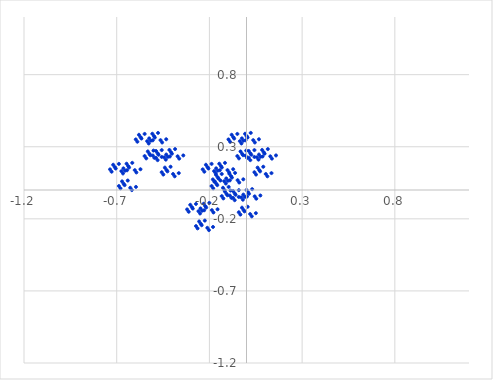
| Category | Series 0 |
|---|---|
| 0.0 | 0 |
| 0.00855245310052131 | -0.016 |
| 0.030649540012601 | 0.006 |
| -0.0171049062010425 | -0.032 |
| -0.00855245310052136 | -0.048 |
| 0.0135446338115583 | -0.026 |
| 0.0441941738241594 | -0.044 |
| 0.0527466269246802 | -0.06 |
| 0.0748437138367601 | -0.038 |
| -0.0722217192976518 | -0.007 |
| -0.0636692661971308 | -0.023 |
| -0.0415721792850513 | -0.001 |
| -0.0893266254986948 | -0.039 |
| -0.0807741723981737 | -0.055 |
| -0.0586770854860936 | -0.033 |
| -0.028027545473493 | -0.051 |
| -0.0194750923729719 | -0.067 |
| 0.0026219945391079 | -0.045 |
| -0.0243862902520157 | -0.123 |
| -0.0158338371514948 | -0.139 |
| 0.00626324976058479 | -0.117 |
| -0.0414911964530583 | -0.155 |
| -0.0329387433525374 | -0.171 |
| -0.0108416564404578 | -0.149 |
| 0.019807883572143 | -0.167 |
| 0.028360336672664 | -0.183 |
| 0.0504574235847445 | -0.161 |
| -0.0920773248729208 | 0.112 |
| -0.0835248717723997 | 0.096 |
| -0.0614277848603201 | 0.118 |
| -0.109182231073963 | 0.08 |
| -0.100629777973442 | 0.064 |
| -0.0785326910613623 | 0.086 |
| -0.0478831510487616 | 0.068 |
| -0.0393306979482406 | 0.052 |
| -0.0172336110361608 | 0.074 |
| -0.164299044170573 | 0.105 |
| -0.155746591070052 | 0.089 |
| -0.133649504157973 | 0.111 |
| -0.181403950371616 | 0.073 |
| -0.172851497271095 | 0.057 |
| -0.150754410359015 | 0.079 |
| -0.120104870346413 | 0.061 |
| -0.111552417245893 | 0.045 |
| -0.089455330333813 | 0.067 |
| -0.116463615124937 | -0.01 |
| -0.107911162024416 | -0.026 |
| -0.0858140751123364 | -0.004 |
| -0.13356852132598 | -0.042 |
| -0.125016068225458 | -0.058 |
| -0.102918981313379 | -0.036 |
| -0.0722694413007778 | -0.055 |
| -0.0637169882002568 | -0.071 |
| -0.0416199012881766 | -0.048 |
| -0.230969883127822 | -0.096 |
| -0.2224174300273 | -0.112 |
| -0.20032034311522 | -0.09 |
| -0.248074789328864 | -0.128 |
| -0.239522336228342 | -0.144 |
| -0.217425249316263 | -0.122 |
| -0.186775709303662 | -0.14 |
| -0.178223256203141 | -0.156 |
| -0.156126169291061 | -0.134 |
| -0.303191602425473 | -0.103 |
| -0.294639149324952 | -0.119 |
| -0.272542062412873 | -0.097 |
| -0.320296508626516 | -0.135 |
| -0.311744055525995 | -0.151 |
| -0.289646968613916 | -0.129 |
| -0.258997428601314 | -0.147 |
| -0.250444975500793 | -0.163 |
| -0.228347888588714 | -0.141 |
| -0.255356173379837 | -0.218 |
| -0.246803720279316 | -0.234 |
| -0.224706633367237 | -0.212 |
| -0.27246107958088 | -0.25 |
| -0.263908626480359 | -0.266 |
| -0.241811539568279 | -0.244 |
| -0.211161999555678 | -0.262 |
| -0.202609546455157 | -0.278 |
| -0.180512459543077 | -0.256 |
| 0.084265193848727 | 0.278 |
| 0.092817646949249 | 0.262 |
| 0.114914733861329 | 0.284 |
| 0.067160287647685 | 0.246 |
| 0.075712740748206 | 0.23 |
| 0.097809827660286 | 0.252 |
| 0.128459367672887 | 0.234 |
| 0.137011820773408 | 0.218 |
| 0.159108907685487 | 0.24 |
| 0.012043474551076 | 0.271 |
| 0.020595927651597 | 0.255 |
| 0.042693014563677 | 0.277 |
| -0.00506143164996697 | 0.239 |
| 0.00349102145055402 | 0.223 |
| 0.025588108362634 | 0.245 |
| 0.056237648375235 | 0.226 |
| 0.064790101475755 | 0.21 |
| 0.086887188387836 | 0.233 |
| 0.059878903596712 | 0.155 |
| 0.068431356697232 | 0.139 |
| 0.090528443609312 | 0.161 |
| 0.04277399739567 | 0.123 |
| 0.05132645049619 | 0.107 |
| 0.07342353740827 | 0.129 |
| 0.104073077420871 | 0.111 |
| 0.112625530521392 | 0.095 |
| 0.134722617433472 | 0.117 |
| -0.00781213102419298 | 0.39 |
| 0.000740322076328015 | 0.374 |
| 0.022837408988407 | 0.396 |
| -0.024917037225236 | 0.358 |
| -0.016364584124714 | 0.342 |
| 0.00573250278736498 | 0.364 |
| 0.036382042799965 | 0.346 |
| 0.044934495900487 | 0.33 |
| 0.067031582812567 | 0.352 |
| -0.080033850321845 | 0.383 |
| -0.071481397221324 | 0.367 |
| -0.0493843103092449 | 0.389 |
| -0.0971387565228879 | 0.351 |
| -0.088586303422368 | 0.335 |
| -0.0664892165102881 | 0.357 |
| -0.035839676497686 | 0.339 |
| -0.0272872233971651 | 0.323 |
| -0.00519013648508604 | 0.345 |
| -0.032198421276209 | 0.267 |
| -0.023645968175689 | 0.251 |
| -0.00154888126360897 | 0.273 |
| -0.049303327477252 | 0.235 |
| -0.04075087437673 | 0.219 |
| -0.018653787464651 | 0.241 |
| 0.01199575254795 | 0.223 |
| 0.020548205648471 | 0.207 |
| 0.042645292560551 | 0.229 |
| -0.146704689279094 | 0.182 |
| -0.138152236178572 | 0.166 |
| -0.116055149266493 | 0.188 |
| -0.163809595480137 | 0.15 |
| -0.155257142379615 | 0.134 |
| -0.133160055467536 | 0.156 |
| -0.102510515454935 | 0.138 |
| -0.093958062354414 | 0.122 |
| -0.0718609754423331 | 0.144 |
| -0.218926408576745 | 0.175 |
| -0.210373955476225 | 0.159 |
| -0.188276868564146 | 0.181 |
| -0.236031314777788 | 0.143 |
| -0.227478861677268 | 0.127 |
| -0.205381774765188 | 0.149 |
| -0.174732234752586 | 0.131 |
| -0.166179781652066 | 0.115 |
| -0.144082694739986 | 0.137 |
| -0.17109097953111 | 0.06 |
| -0.162538526430589 | 0.044 |
| -0.140441439518509 | 0.066 |
| -0.188195885732152 | 0.028 |
| -0.179643432631631 | 0.012 |
| -0.157546345719551 | 0.034 |
| -0.12689680570695 | 0.015 |
| -0.118344352606429 | -0.001 |
| -0.09624726569435 | 0.021 |
| -0.415734806151273 | 0.278 |
| -0.407182353050751 | 0.262 |
| -0.385085266138671 | 0.284 |
| -0.432839712352315 | 0.246 |
| -0.424287259251794 | 0.23 |
| -0.402190172339714 | 0.252 |
| -0.371540632327113 | 0.234 |
| -0.362988179226592 | 0.218 |
| -0.340891092314513 | 0.24 |
| -0.487956525448924 | 0.271 |
| -0.479404072348403 | 0.255 |
| -0.457306985436323 | 0.277 |
| -0.505061431649967 | 0.239 |
| -0.496508978549446 | 0.223 |
| -0.474411891637366 | 0.245 |
| -0.443762351624765 | 0.226 |
| -0.435209898524245 | 0.21 |
| -0.413112811612164 | 0.233 |
| -0.440121096403288 | 0.155 |
| -0.431568643302768 | 0.139 |
| -0.409471556390688 | 0.161 |
| -0.45722600260433 | 0.123 |
| -0.44867354950381 | 0.107 |
| -0.42657646259173 | 0.129 |
| -0.395926922579129 | 0.111 |
| -0.387374469478608 | 0.095 |
| -0.365277382566528 | 0.117 |
| -0.507812131024193 | 0.39 |
| -0.499259677923672 | 0.374 |
| -0.477162591011593 | 0.396 |
| -0.524917037225236 | 0.358 |
| -0.516364584124714 | 0.342 |
| -0.494267497212635 | 0.364 |
| -0.463617957200035 | 0.346 |
| -0.455065504099513 | 0.33 |
| -0.432968417187433 | 0.352 |
| -0.580033850321845 | 0.383 |
| -0.571481397221324 | 0.367 |
| -0.549384310309245 | 0.389 |
| -0.597138756522888 | 0.351 |
| -0.588586303422368 | 0.335 |
| -0.566489216510288 | 0.357 |
| -0.535839676497686 | 0.339 |
| -0.527287223397165 | 0.323 |
| -0.505190136485086 | 0.345 |
| -0.532198421276209 | 0.267 |
| -0.523645968175689 | 0.251 |
| -0.501548881263609 | 0.273 |
| -0.549303327477252 | 0.235 |
| -0.54075087437673 | 0.219 |
| -0.518653787464651 | 0.241 |
| -0.48800424745205 | 0.223 |
| -0.479451794351529 | 0.207 |
| -0.457354707439449 | 0.229 |
| -0.646704689279094 | 0.182 |
| -0.638152236178572 | 0.166 |
| -0.616055149266493 | 0.188 |
| -0.663809595480137 | 0.15 |
| -0.655257142379615 | 0.134 |
| -0.633160055467536 | 0.156 |
| -0.602510515454935 | 0.138 |
| -0.593958062354414 | 0.122 |
| -0.571860975442333 | 0.144 |
| -0.718926408576745 | 0.175 |
| -0.710373955476225 | 0.159 |
| -0.688276868564146 | 0.181 |
| -0.736031314777788 | 0.143 |
| -0.727478861677268 | 0.127 |
| -0.705381774765188 | 0.149 |
| -0.674732234752586 | 0.131 |
| -0.666179781652066 | 0.115 |
| -0.644082694739986 | 0.137 |
| -0.67109097953111 | 0.06 |
| -0.662538526430589 | 0.044 |
| -0.640441439518509 | 0.066 |
| -0.688195885732152 | 0.028 |
| -0.679643432631631 | 0.012 |
| -0.657546345719551 | 0.034 |
| -0.62689680570695 | 0.015 |
| -0.618344352606429 | -0.001 |
| -0.59624726569435 | 0.021 |